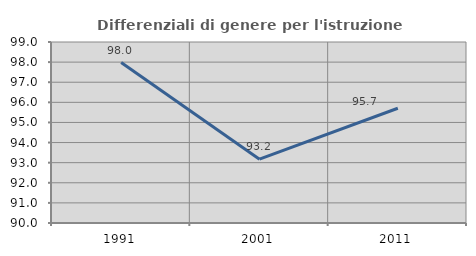
| Category | Differenziali di genere per l'istruzione superiore |
|---|---|
| 1991.0 | 97.978 |
| 2001.0 | 93.173 |
| 2011.0 | 95.705 |